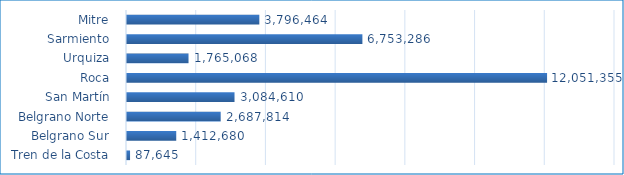
| Category | Total |
|---|---|
| Mitre  | 3796464 |
| Sarmiento  | 6753286 |
| Urquiza  | 1765068 |
| Roca  | 12051355 |
| San Martín  | 3084610 |
| Belgrano Norte  | 2687814 |
| Belgrano Sur  | 1412680 |
| Tren de la Costa  | 87645 |